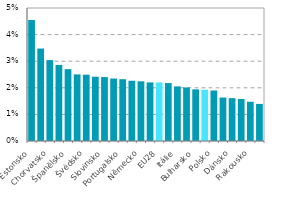
| Category | Series 0 |
|---|---|
| Estonsko | 0.045 |
| Řecko | 0.035 |
| Chorvatsko | 0.03 |
| Rumunsko | 0.029 |
| Španělsko | 0.027 |
| Francie | 0.025 |
| Švédsko | 0.025 |
| Maďarsko | 0.024 |
| Slovinsko | 0.024 |
| Velká Británie | 0.023 |
| Portugalsko | 0.023 |
| Lotyšsko | 0.023 |
| Německo | 0.022 |
| Finsko | 0.022 |
| EU28 | 0.022 |
| Slovensko | 0.022 |
| Itálie | 0.021 |
| Irsko | 0.02 |
| Bulharsko | 0.019 |
| Česko | 0.019 |
| Polsko | 0.019 |
| Litva | 0.016 |
| Dánsko | 0.016 |
| Belgie | 0.016 |
| Rakousko | 0.015 |
| Nizozemsko | 0.014 |